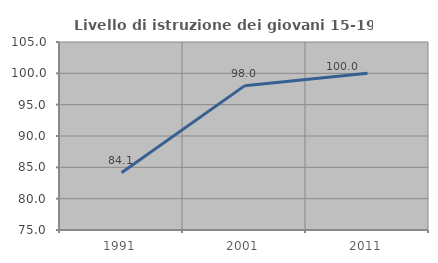
| Category | Livello di istruzione dei giovani 15-19 anni |
|---|---|
| 1991.0 | 84.127 |
| 2001.0 | 98 |
| 2011.0 | 100 |